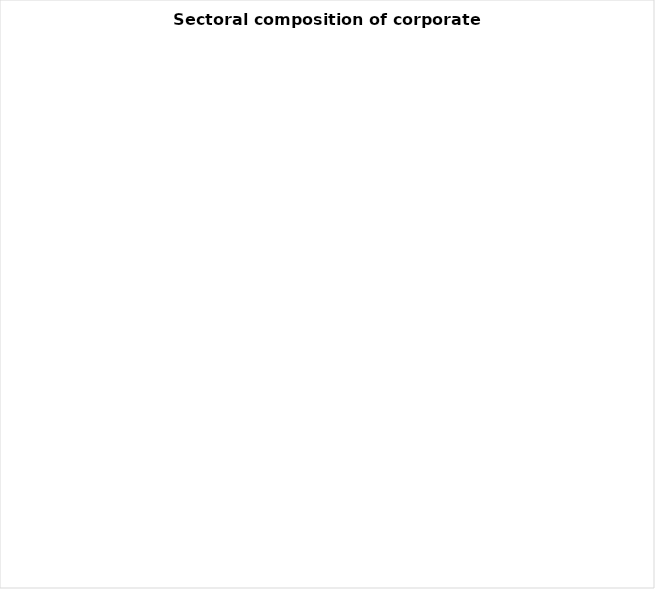
| Category | Series 0 |
|---|---|
| Agriculture | 0 |
| Banks | 0 |
| Mining industry | 0 |
| Light industry | 0 |
| Engineering industry | 0 |
| Oil and gas | 0 |
| Food industry | 0 |
| Communication | 0 |
| Construction and development | 0 |
| Trade and retail | 0 |
| Transportation | 0 |
| Financial institutions | 0 |
| Chemical and petrochemical industry | 0 |
| Non-ferrous metals | 0 |
| Ferrous metals | 0 |
| Other sectors | 0 |